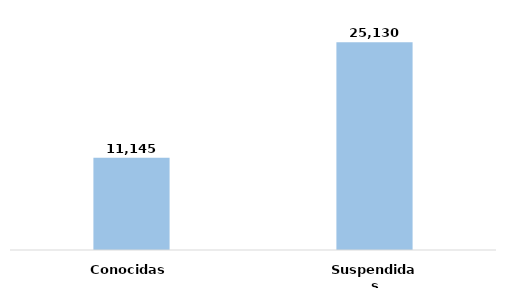
| Category | Series 0 |
|---|---|
| Conocidas | 0.307 |
| Suspendidas | 0.693 |